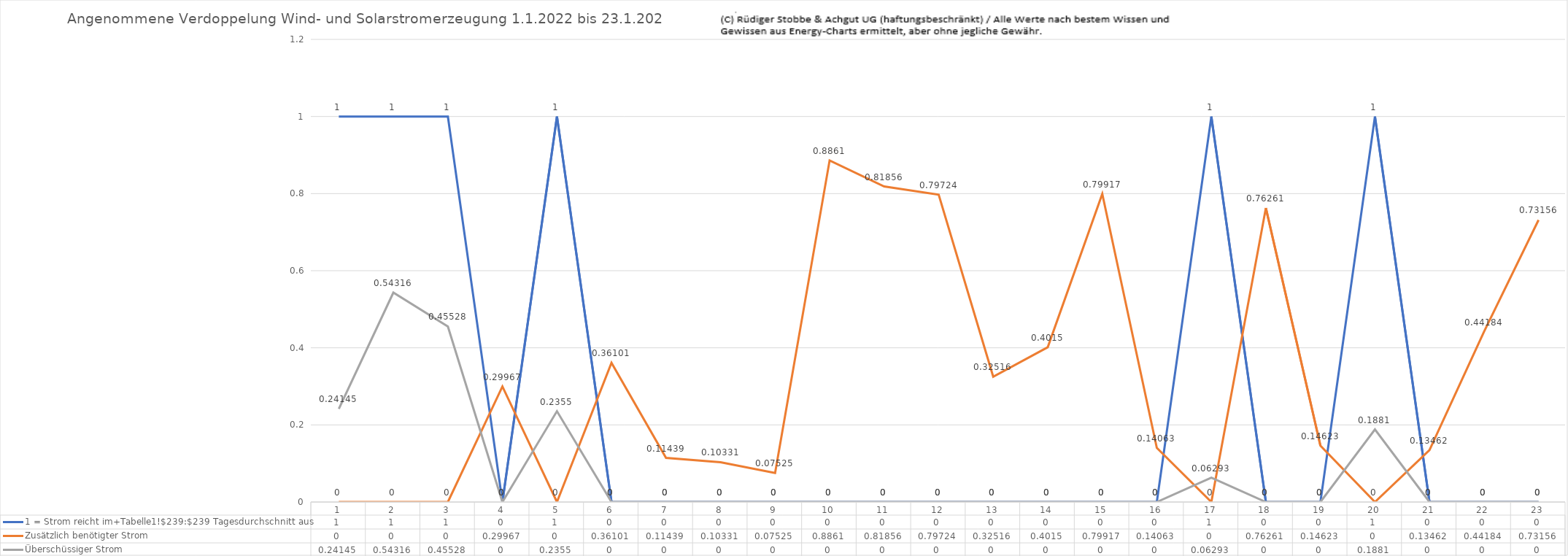
| Category | 1 = Strom reicht im+Tabelle1!$239:$239 Tagesdurchschnitt aus | Zusätzlich benötigter Strom | Überschüssiger Strom |
|---|---|---|---|
| 0 | 1 | 0 | 0.241 |
| 1 | 1 | 0 | 0.543 |
| 2 | 1 | 0 | 0.455 |
| 3 | 0 | 0.3 | 0 |
| 4 | 1 | 0 | 0.236 |
| 5 | 0 | 0.361 | 0 |
| 6 | 0 | 0.114 | 0 |
| 7 | 0 | 0.103 | 0 |
| 8 | 0 | 0.075 | 0 |
| 9 | 0 | 0.886 | 0 |
| 10 | 0 | 0.819 | 0 |
| 11 | 0 | 0.797 | 0 |
| 12 | 0 | 0.325 | 0 |
| 13 | 0 | 0.402 | 0 |
| 14 | 0 | 0.799 | 0 |
| 15 | 0 | 0.141 | 0 |
| 16 | 1 | 0 | 0.063 |
| 17 | 0 | 0.763 | 0 |
| 18 | 0 | 0.146 | 0 |
| 19 | 1 | 0 | 0.188 |
| 20 | 0 | 0.135 | 0 |
| 21 | 0 | 0.442 | 0 |
| 22 | 0 | 0.732 | 0 |